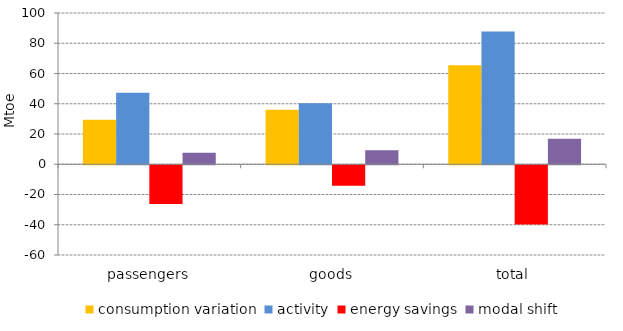
| Category | consumption variation | activity | energy savings | modal shift |
|---|---|---|---|---|
| passengers | 29.448 | 47.352 | -25.554 | 7.65 |
| goods | 36.068 | 40.41 | -13.59 | 9.248 |
| total | 65.516 | 87.762 | -39.144 | 16.898 |